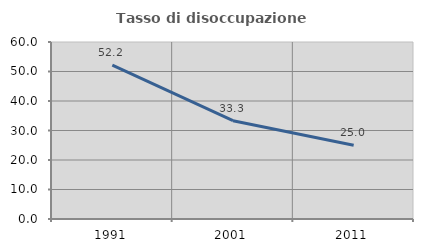
| Category | Tasso di disoccupazione giovanile  |
|---|---|
| 1991.0 | 52.174 |
| 2001.0 | 33.333 |
| 2011.0 | 25 |